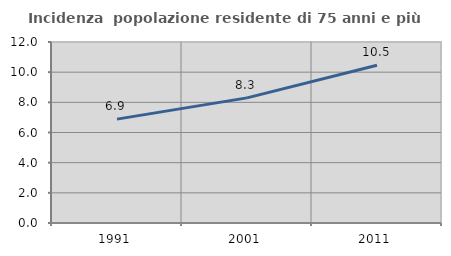
| Category | Incidenza  popolazione residente di 75 anni e più |
|---|---|
| 1991.0 | 6.887 |
| 2001.0 | 8.296 |
| 2011.0 | 10.454 |